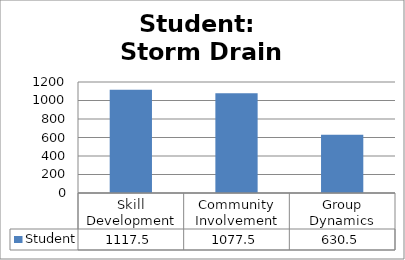
| Category | Student |
|---|---|
| Skill Development | 1117.5 |
| Community Involvement | 1077.5 |
| Group Dynamics | 630.5 |